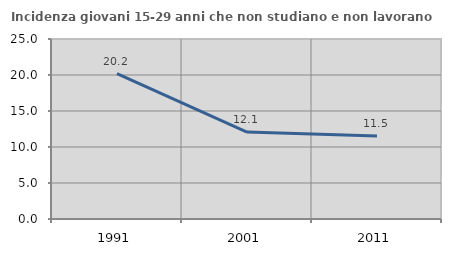
| Category | Incidenza giovani 15-29 anni che non studiano e non lavorano  |
|---|---|
| 1991.0 | 20.181 |
| 2001.0 | 12.081 |
| 2011.0 | 11.538 |